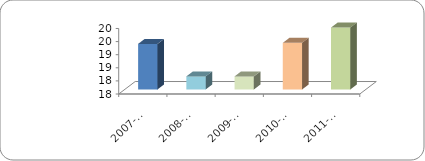
| Category | ALUMNO POR PRESTADOR DE SERVICIOS PROFESIONALES (PSP) |
|---|---|
| 2007-2008 | 19.24 |
| 2008-2009 | 18 |
| 2009-2010 | 18 |
| 2010-2011 | 19.279 |
| 2011-2012 | 19.861 |